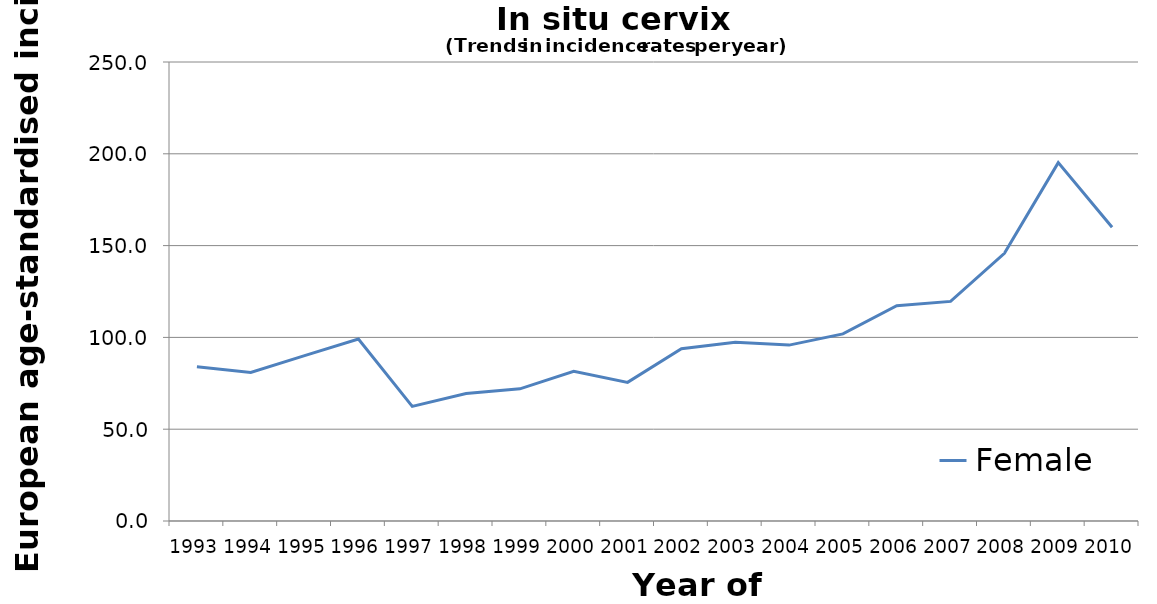
| Category | Female |
|---|---|
| 1993.0 | 84 |
| 1994.0 | 80.9 |
| 1995.0 | 90.1 |
| 1996.0 | 99.1 |
| 1997.0 | 62.4 |
| 1998.0 | 69.4 |
| 1999.0 | 72 |
| 2000.0 | 81.5 |
| 2001.0 | 75.5 |
| 2002.0 | 93.8 |
| 2003.0 | 97.4 |
| 2004.0 | 95.8 |
| 2005.0 | 101.9 |
| 2006.0 | 117.3 |
| 2007.0 | 119.6 |
| 2008.0 | 145.8 |
| 2009.0 | 195.2 |
| 2010.0 | 160 |